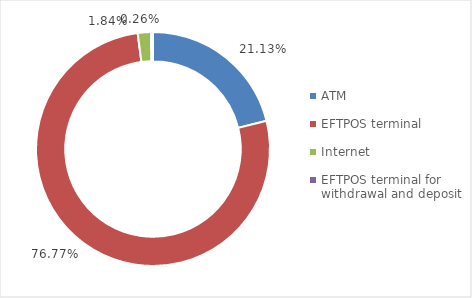
| Category | Series 0 |
|---|---|
| ATM | 9941185 |
| EFTPOS terminal | 36120887 |
| Internet | 864445 |
| EFTPOS terminal for withdrawal and deposit | 123185 |